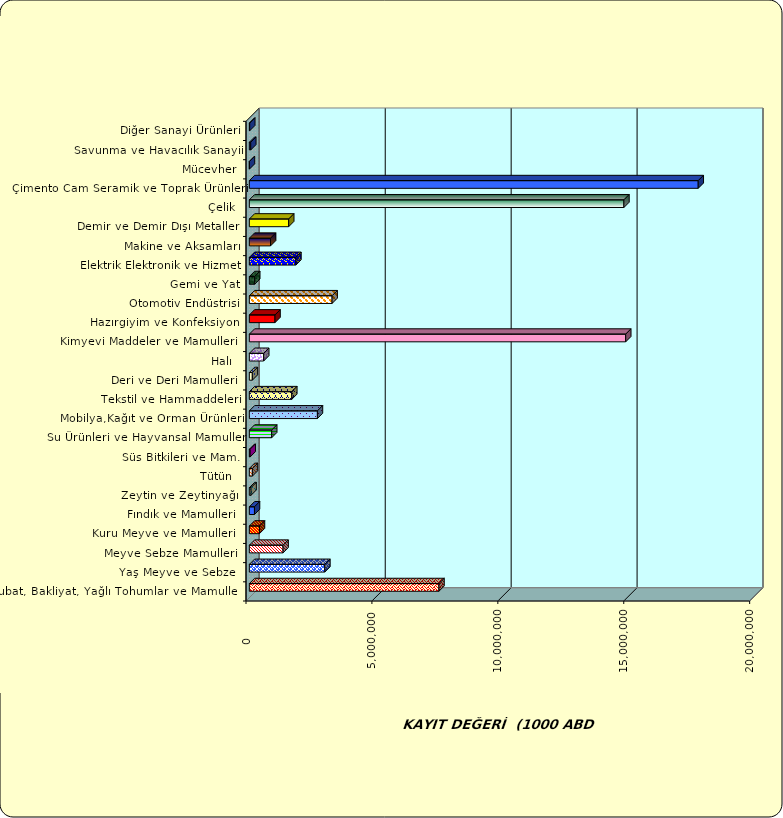
| Category | Series 0 |
|---|---|
|  Hububat, Bakliyat, Yağlı Tohumlar ve Mamulleri  | 7529375.068 |
|  Yaş Meyve ve Sebze   | 2997039.092 |
|  Meyve Sebze Mamulleri  | 1338917.077 |
|  Kuru Meyve ve Mamulleri   | 401003.697 |
|  Fındık ve Mamulleri  | 203384.423 |
|  Zeytin ve Zeytinyağı  | 66817.578 |
|  Tütün  | 120616.374 |
|  Süs Bitkileri ve Mam. | 32037.27 |
|  Su Ürünleri ve Hayvansal Mamuller | 887008.474 |
|  Mobilya,Kağıt ve Orman Ürünleri | 2702477.414 |
|  Tekstil ve Hammaddeleri | 1684284.061 |
|  Deri ve Deri Mamulleri  | 118530.834 |
|  Halı  | 569789.283 |
|  Kimyevi Maddeler ve Mamulleri   | 14944512.975 |
|  Hazırgiyim ve Konfeksiyon  | 1018880.895 |
|  Otomotiv Endüstrisi | 3285588.984 |
|  Gemi ve Yat | 212371.789 |
|  Elektrik Elektronik ve Hizmet | 1847464.072 |
|  Makine ve Aksamları | 842460.879 |
|  Demir ve Demir Dışı Metaller  | 1562417.167 |
|  Çelik | 14873453.956 |
|  Çimento Cam Seramik ve Toprak Ürünleri | 17824255.523 |
|  Mücevher | 2447.828 |
|  Savunma ve Havacılık Sanayii | 55227.072 |
|  Diğer Sanayi Ürünleri | 14797.6 |